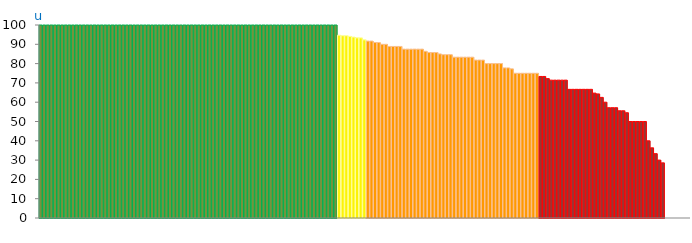
| Category | Top Quartile | 2nd Quartile | 3rd Quartile | Bottom Quartile | Series 4 |
|---|---|---|---|---|---|
| u | 100 | 0 | 0 | 0 | 100 |